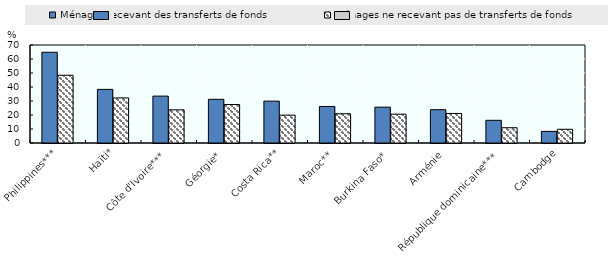
| Category | Ménages recevant des transferts de fonds | Ménages ne recevant pas de transferts de fonds |
|---|---|---|
| Philippines*** | 64.8 | 48.4 |
| Haïti* | 38.3 | 32.2 |
| Côte d'Ivoire*** | 33.5 | 23.7 |
| Géorgie* | 31.2 | 27.5 |
| Costa Rica** | 29.9 | 19.9 |
| Maroc** | 26.1 | 20.9 |
| Burkina Faso* | 25.6 | 20.6 |
| Arménie | 23.8 | 21.1 |
| République dominicaine*** | 16.2 | 10.9 |
| Cambodge | 8.3 | 9.8 |